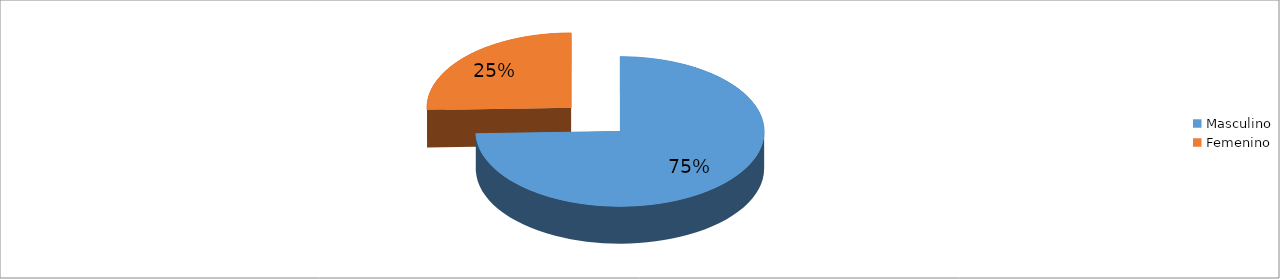
| Category | Series 0 |
|---|---|
| Masculino | 0.745 |
| Femenino | 0.255 |